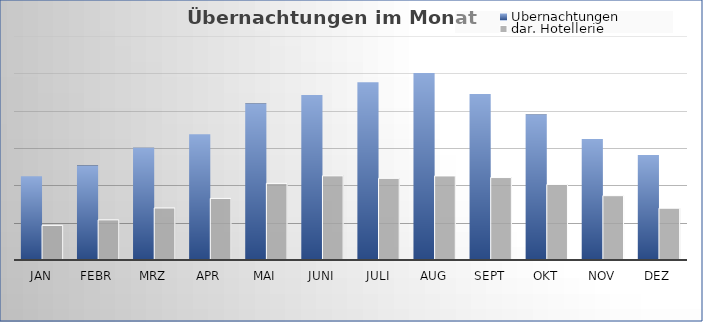
| Category | Übernachtungen | dar. Hotellerie |
|---|---|---|
| Jan | 22414 | 9277 |
| Febr | 25286 | 10754 |
| Mrz | 30078 | 13935 |
| Apr | 33651 | 16495 |
| Mai | 41897 | 20524 |
| Juni | 44169 | 22544 |
| Juli | 47645 | 21871 |
| Aug | 50084 | 22519 |
| Sept | 44437 | 22085 |
| Okt | 38956 | 20194 |
| Nov | 32437 | 17227 |
| Dez | 28110 | 13870 |